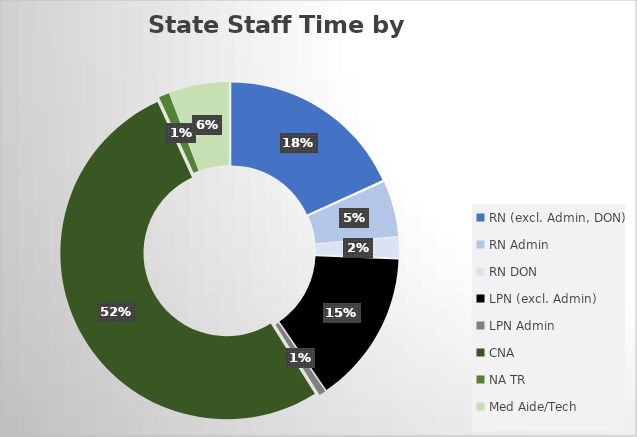
| Category | Series 0 |
|---|---|
| RN (excl. Admin, DON) | 16159.693 |
| RN Admin | 4764.041 |
| RN DON | 1781.594 |
| LPN (excl. Admin) | 13149.135 |
| LPN Admin | 583.97 |
| CNA | 46194.112 |
| NA TR | 905.411 |
| Med Aide/Tech | 5148.514 |